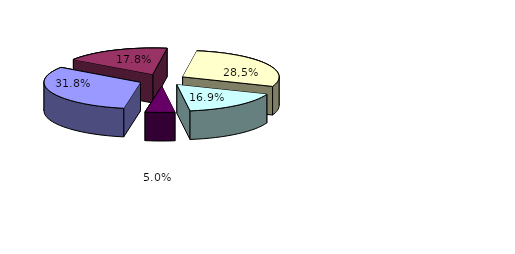
| Category | Series 0 |
|---|---|
| tarix muzeyləri | 77 |
| xatirə muzeyləri | 43 |
| diyarşünaslıq muzeyləri | 69 |
| incəsənət muzeyləri | 41 |
| digər muzeylər | 12 |